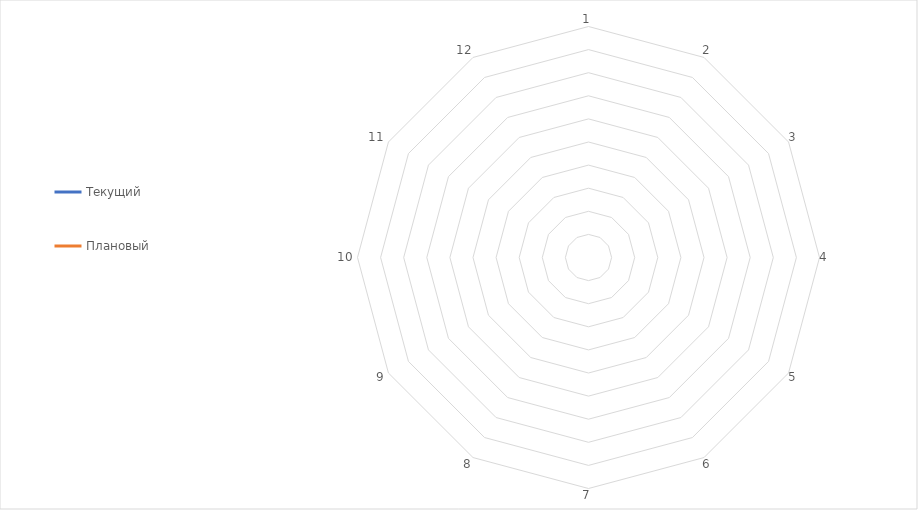
| Category | Текущий | Плановый |
|---|---|---|
| 1.0 | 0 | 0 |
| 2.0 | 0 | 0 |
| 3.0 | 0 | 0 |
| 4.0 | 0 | 0 |
| 5.0 | 0 | 0 |
| 6.0 | 0 | 0 |
| 7.0 | 0 | 0 |
| 8.0 | 0 | 0 |
| 9.0 | 0 | 0 |
| 10.0 | 0 | 0 |
| 11.0 | 0 | 0 |
| 12.0 | 0 | 0 |